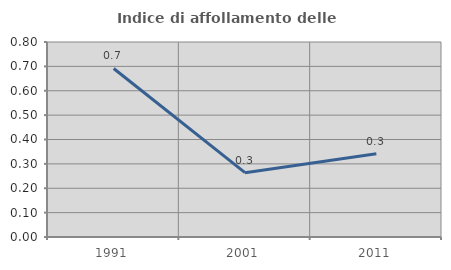
| Category | Indice di affollamento delle abitazioni  |
|---|---|
| 1991.0 | 0.691 |
| 2001.0 | 0.264 |
| 2011.0 | 0.342 |